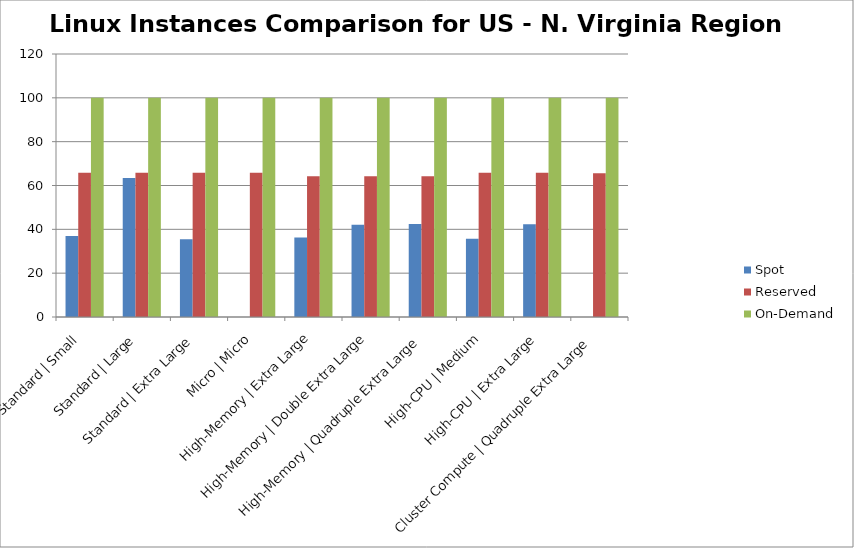
| Category | Spot | Reserved | On-Demand |
|---|---|---|---|
| Standard | Small | 37 | 65.847 | 100 |
| Standard | Large | 63.445 | 65.847 | 100 |
| Standard | Extra Large | 35.48 | 65.847 | 100 |
| Micro | Micro | 0 | 65.822 | 100 |
| High-Memory | Extra Large | 36.293 | 64.251 | 100 |
| High-Memory | Double Extra Large | 42.04 | 64.251 | 100 |
| High-Memory | Quadruple Extra Large | 42.411 | 64.251 | 100 |
| High-CPU | Medium | 35.67 | 65.847 | 100 |
| High-CPU | Extra Large | 42.283 | 65.847 | 100 |
| Cluster Compute | Quadruple Extra Large | 0 | 65.608 | 100 |